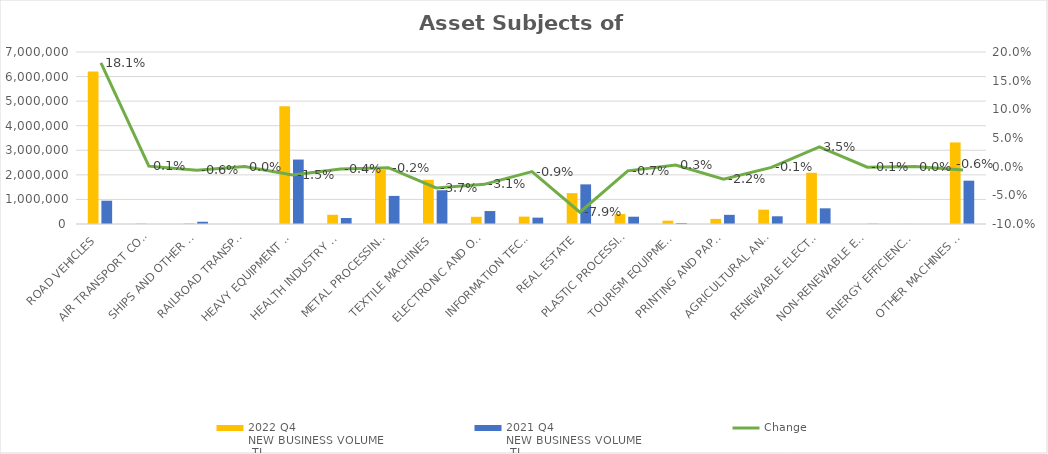
| Category | 2022 Q4 
NEW BUSINESS VOLUME
 TL | 2021 Q4 
NEW BUSINESS VOLUME
 TL |
|---|---|---|
| ROAD VEHICLES | 6205507.536 | 948376.468 |
| AIR TRANSPORT CONVEYANCE | 22149 | 0 |
| SHIPS AND OTHER SEA-GOING VESSELS | 32156 | 91835.524 |
| RAILROAD TRANSPORT VEHICLES | 2337 | 0 |
| HEAVY EQUIPMENT AND CONSTRUCTION MACHINERY | 4792789.163 | 2623130.981 |
| HEALTH INDUSTRY AND AESTHETIC INSTRUMENTS | 375571.826 | 243321.652 |
| METAL PROCESSING MACHINE | 2199682.716 | 1143085.516 |
| TEXTILE MACHINES | 1799477.464 | 1373907.98 |
| ELECTRONIC AND OPTICAL DEVICES | 293173.535 | 527645.198 |
| INFORMATION TECHNOLOGIES AND OFFICE SYSTEMS | 300661.237 | 259140.056 |
| REAL ESTATE | 1255803.29 | 1613184.13 |
| PLASTIC PROCESSING MACHINES | 405529.236 | 296276.19 |
| TOURISM EQUIPMENT | 136315.941 | 35378.869 |
| PRINTING AND PAPER PROCESSING MACHINES | 207078.963 | 372894.248 |
| AGRICULTURAL AND LIVESTOCK FARMING MACHINES | 584922.906 | 314023.297 |
| RENEWABLE ELECTRICITY GENERATION | 2084702.188 | 638030.274 |
| NON-RENEWABLE ELECTRIC ENERGY GENERATION | 0 | 9877.067 |
| ENERGY EFFICIENCY EQUIPMENT | 5470 | 465.715 |
| OTHER MACHINES AND EQUIPMENT | 3320587.501 | 1763245.955 |